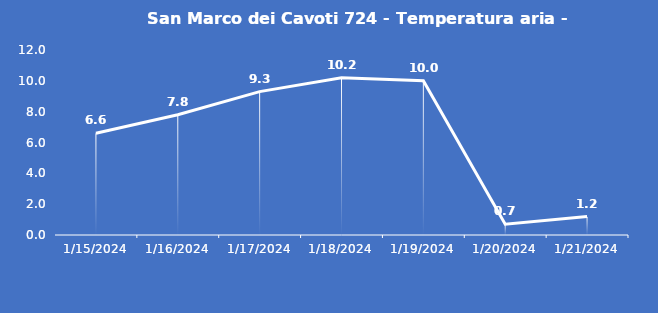
| Category | San Marco dei Cavoti 724 - Temperatura aria - Grezzo (°C) |
|---|---|
| 1/15/24 | 6.6 |
| 1/16/24 | 7.8 |
| 1/17/24 | 9.3 |
| 1/18/24 | 10.2 |
| 1/19/24 | 10 |
| 1/20/24 | 0.7 |
| 1/21/24 | 1.2 |